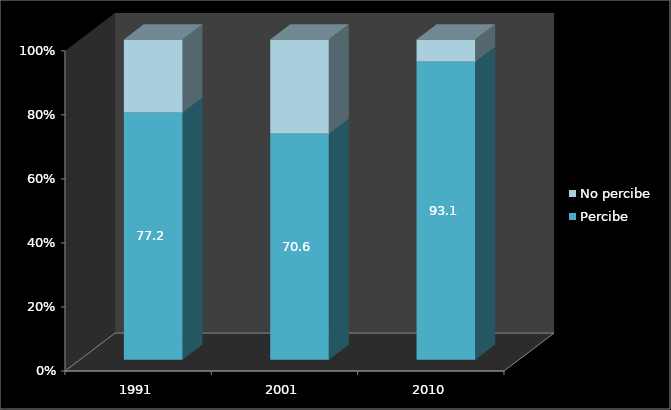
| Category | Percibe | No percibe |
|---|---|---|
| 1991.0 | 77.152 | 22.785 |
| 2001.0 | 70.646 | 29.354 |
| 2010.0 | 93.099 | 6.901 |